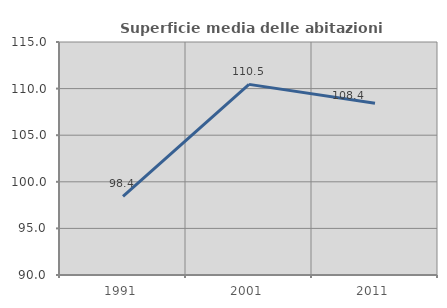
| Category | Superficie media delle abitazioni occupate |
|---|---|
| 1991.0 | 98.44 |
| 2001.0 | 110.453 |
| 2011.0 | 108.429 |